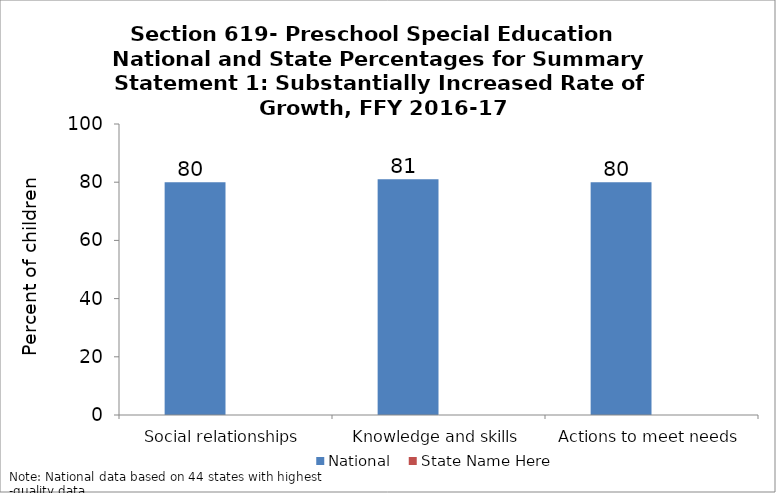
| Category | National | State Name Here |
|---|---|---|
| Social relationships | 80 |  |
| Knowledge and skills | 81 |  |
| Actions to meet needs | 80 |  |